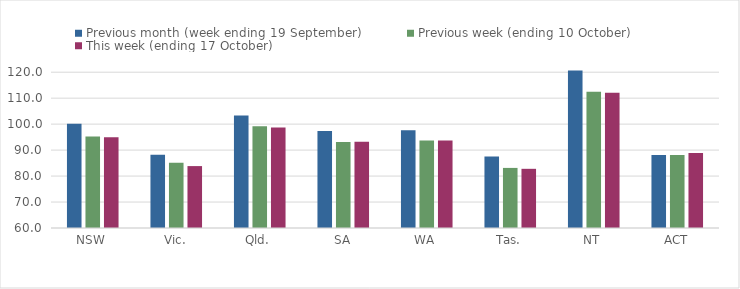
| Category | Previous month (week ending 19 September) | Previous week (ending 10 October) | This week (ending 17 October) |
|---|---|---|---|
| NSW | 100.15 | 95.27 | 94.99 |
| Vic. | 88.25 | 85.14 | 83.84 |
| Qld. | 103.34 | 99.14 | 98.7 |
| SA | 97.31 | 93.07 | 93.25 |
| WA | 97.67 | 93.7 | 93.73 |
| Tas. | 87.55 | 83.14 | 82.79 |
| NT | 120.61 | 112.47 | 112.12 |
| ACT | 88.07 | 88.07 | 88.9 |